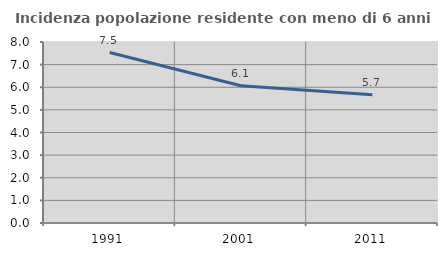
| Category | Incidenza popolazione residente con meno di 6 anni |
|---|---|
| 1991.0 | 7.533 |
| 2001.0 | 6.069 |
| 2011.0 | 5.669 |